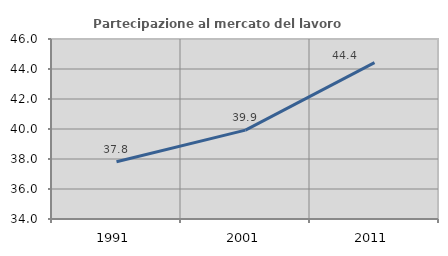
| Category | Partecipazione al mercato del lavoro  femminile |
|---|---|
| 1991.0 | 37.819 |
| 2001.0 | 39.926 |
| 2011.0 | 44.423 |